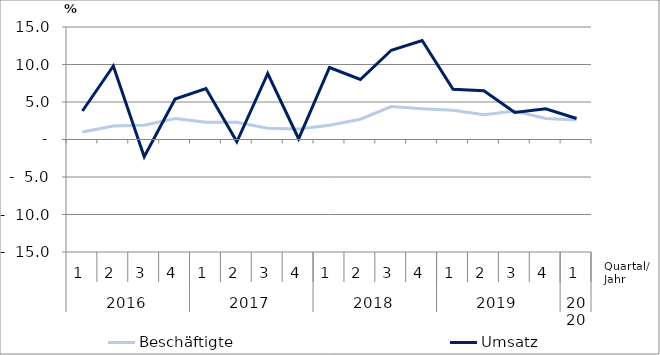
| Category | Beschäftigte | Umsatz |
|---|---|---|
| 0 | 1 | 3.8 |
| 1 | 1.8 | 9.8 |
| 2 | 1.9 | -2.3 |
| 3 | 2.8 | 5.4 |
| 4 | 2.3 | 6.8 |
| 5 | 2.3 | -0.3 |
| 6 | 1.5 | 8.8 |
| 7 | 1.4 | 0.1 |
| 8 | 1.9 | 9.6 |
| 9 | 2.7 | 8 |
| 10 | 4.4 | 11.9 |
| 11 | 4.1 | 13.2 |
| 12 | 3.9 | 6.7 |
| 13 | 3.3 | 6.5 |
| 14 | 3.8 | 3.6 |
| 15 | 2.8 | 4.1 |
| 16 | 2.6 | 2.8 |